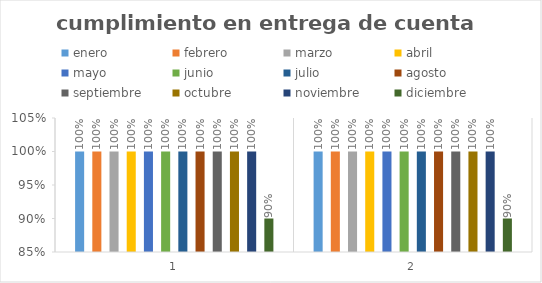
| Category | enero | febrero | marzo | abril | mayo | junio  | julio | agosto | septiembre | octubre  | noviembre  | diciembre |
|---|---|---|---|---|---|---|---|---|---|---|---|---|
| 0 | 1 | 1 | 1 | 1 | 1 | 1 | 1 | 1 | 1 | 1 | 1 | 0.9 |
| 1 | 1 | 1 | 1 | 1 | 1 | 1 | 1 | 1 | 1 | 1 | 1 | 0.9 |